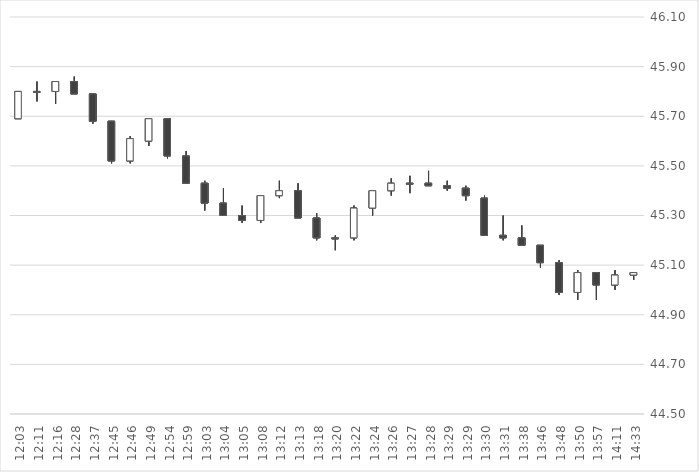
| Category | Series 0 | Series 1 | Series 2 | Series 3 |
|---|---|---|---|---|
| 2016-11-17 14:33:13 | 45.06 | 45.07 | 45.04 | 45.07 |
| 2016-11-17 14:11:47 | 45.02 | 45.08 | 45 | 45.06 |
| 2016-11-17 13:57:26 | 45.07 | 45.07 | 44.96 | 45.02 |
| 2016-11-17 13:50:36 | 44.99 | 45.08 | 44.96 | 45.07 |
| 2016-11-17 13:48:20 | 45.11 | 45.12 | 44.98 | 44.99 |
| 2016-11-17 13:46:31 | 45.18 | 45.18 | 45.09 | 45.11 |
| 2016-11-17 13:38:10 | 45.21 | 45.26 | 45.18 | 45.18 |
| 2016-11-17 13:31:51 | 45.22 | 45.3 | 45.2 | 45.21 |
| 2016-11-17 13:30:00 | 45.37 | 45.38 | 45.22 | 45.22 |
| 2016-11-17 13:29:29 | 45.41 | 45.42 | 45.36 | 45.38 |
| 2016-11-17 13:29:05 | 45.42 | 45.44 | 45.4 | 45.41 |
| 2016-11-17 13:28:29 | 45.43 | 45.48 | 45.42 | 45.42 |
| 2016-11-17 13:27:47 | 45.43 | 45.46 | 45.39 | 45.43 |
| 2016-11-17 13:26:31 | 45.4 | 45.45 | 45.38 | 45.43 |
| 2016-11-17 13:24:17 | 45.33 | 45.4 | 45.3 | 45.4 |
| 2016-11-17 13:22:07 | 45.21 | 45.34 | 45.2 | 45.33 |
| 2016-11-17 13:20:55 | 45.21 | 45.22 | 45.16 | 45.21 |
| 2016-11-17 13:18:35 | 45.29 | 45.31 | 45.2 | 45.21 |
| 2016-11-17 13:13:48 | 45.4 | 45.43 | 45.29 | 45.29 |
| 2016-11-17 13:12:16 | 45.38 | 45.44 | 45.37 | 45.4 |
| 2016-11-17 13:08:29 | 45.28 | 45.38 | 45.27 | 45.38 |
| 2016-11-17 13:05:38 | 45.3 | 45.34 | 45.27 | 45.28 |
| 2016-11-17 13:04:16 | 45.35 | 45.41 | 45.3 | 45.3 |
| 2016-11-17 13:03:56 | 45.43 | 45.44 | 45.32 | 45.35 |
| 2016-11-17 12:59:46 | 45.54 | 45.56 | 45.43 | 45.43 |
| 2016-11-17 12:54:31 | 45.69 | 45.69 | 45.53 | 45.54 |
| 2016-11-17 12:49:29 | 45.6 | 45.69 | 45.58 | 45.69 |
| 2016-11-17 12:46:25 | 45.52 | 45.62 | 45.51 | 45.61 |
| 2016-11-17 12:45:33 | 45.68 | 45.68 | 45.51 | 45.52 |
| 2016-11-17 12:37:45 | 45.79 | 45.79 | 45.67 | 45.68 |
| 2016-11-17 12:28:33 | 45.84 | 45.86 | 45.79 | 45.79 |
| 2016-11-17 12:16:57 | 45.8 | 45.84 | 45.75 | 45.84 |
| 2016-11-17 12:11:33 | 45.8 | 45.84 | 45.76 | 45.8 |
| 2016-11-17 12:03:35 | 45.69 | 45.8 | 45.69 | 45.8 |